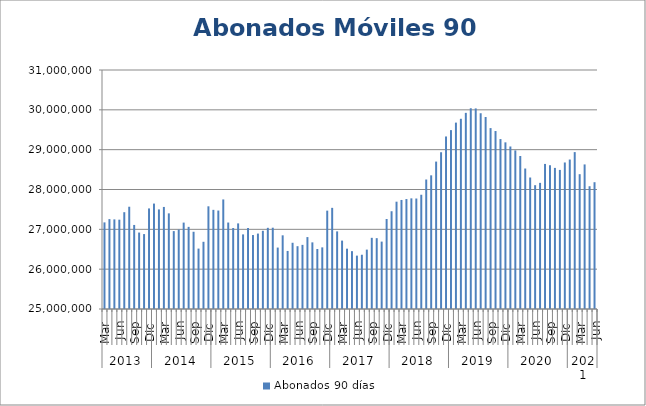
| Category | Abonados 90 días  |
|---|---|
| 0 | 27174429 |
| 1 | 27256799 |
| 2 | 27249896 |
| 3 | 27242396 |
| 4 | 27430194 |
| 5 | 27567464 |
| 6 | 27110010 |
| 7 | 26919316 |
| 8 | 26880609 |
| 9 | 27524963 |
| 10 | 27646717 |
| 11 | 27499992 |
| 12 | 27562088 |
| 13 | 27401040 |
| 14 | 26955717 |
| 15 | 26994609 |
| 16 | 27169188 |
| 17 | 27061687 |
| 18 | 26939071 |
| 19 | 26516500 |
| 20 | 26687326 |
| 21 | 27578143 |
| 22 | 27489223 |
| 23 | 27471553 |
| 24 | 27750473 |
| 25 | 27170692 |
| 26 | 27033211 |
| 27 | 27149172 |
| 28 | 26872979 |
| 29 | 27034173 |
| 30 | 26856662 |
| 31 | 26893632 |
| 32 | 26963755 |
| 33 | 27037951 |
| 34 | 27040824 |
| 35 | 26542149 |
| 36 | 26849710 |
| 37 | 26457447 |
| 38 | 26662676 |
| 39 | 26576782 |
| 40 | 26610099 |
| 41 | 26805521 |
| 42 | 26672717 |
| 43 | 26505805 |
| 44 | 26547173 |
| 45 | 27469211 |
| 46 | 27539556 |
| 47 | 26948853 |
| 48 | 26717067 |
| 49 | 26514588 |
| 50 | 26452370 |
| 51 | 26339907 |
| 52 | 26362130 |
| 53 | 26490787 |
| 54 | 26786764 |
| 55 | 26778405 |
| 56 | 26691976 |
| 57 | 27260107 |
| 58 | 27454349 |
| 59 | 27694179 |
| 60 | 27737550 |
| 61 | 27760296 |
| 62 | 27777818 |
| 63 | 27773600 |
| 64 | 27868225 |
| 65 | 28250702 |
| 66 | 28355724 |
| 67 | 28700770 |
| 68 | 28935345 |
| 69 | 29331337 |
| 70 | 29491024 |
| 71 | 29679237 |
| 72 | 29775295 |
| 73 | 29924167 |
| 74 | 30039747 |
| 75 | 30035533 |
| 76 | 29914508 |
| 77 | 29819526 |
| 78 | 29541515 |
| 79 | 29467889 |
| 80 | 29266254 |
| 81 | 29183632 |
| 82 | 29079792 |
| 83 | 28981844 |
| 84 | 28841431 |
| 85 | 28526784 |
| 86 | 28301120 |
| 87 | 28108523 |
| 88 | 28166641 |
| 89 | 28642033 |
| 90 | 28609093 |
| 91 | 28542251 |
| 92 | 28491894 |
| 93 | 28678391 |
| 94 | 28752211 |
| 95 | 28938768 |
| 96 | 28384493 |
| 97 | 28629528 |
| 98 | 28082081 |
| 99 | 28183255 |